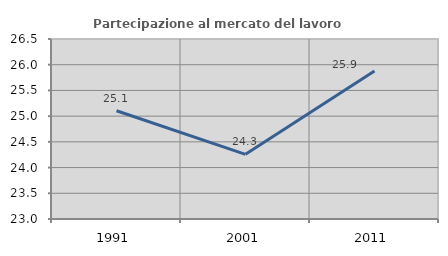
| Category | Partecipazione al mercato del lavoro  femminile |
|---|---|
| 1991.0 | 25.105 |
| 2001.0 | 24.258 |
| 2011.0 | 25.876 |